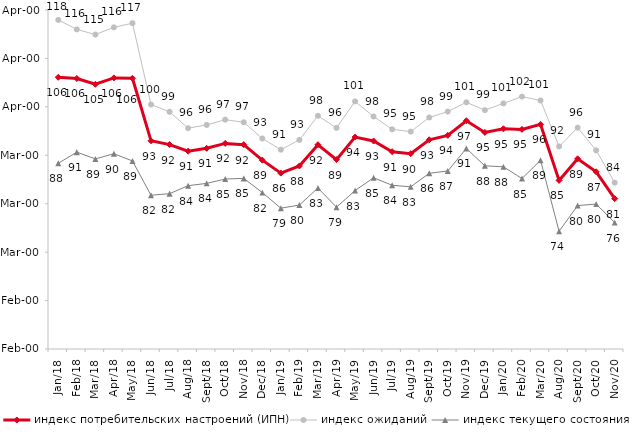
| Category | индекс потребительских настроений (ИПН) | Series 0 | индекс ожиданий | Series 3 | индекс текущего состояния |
|---|---|---|---|---|---|
| 2018-01-01 | 106.11 | 2018-01-01 | 117.95 | 2018-01-01 | 88.35 |
| 2018-02-01 | 105.86 | 2018-02-01 | 116 | 2018-02-01 | 90.65 |
| 2018-03-01 | 104.66 | 2018-03-01 | 114.933 | 2018-03-01 | 89.25 |
| 2018-04-01 | 105.98 | 2018-04-01 | 116.417 | 2018-04-01 | 90.325 |
| 2018-05-01 | 105.9 | 2018-05-01 | 117.283 | 2018-05-01 | 88.825 |
| 2018-06-01 | 92.99 | 2018-06-01 | 100.483 | 2018-06-01 | 81.75 |
| 2018-07-01 | 92.21 | 2018-07-01 | 98.967 | 2018-07-01 | 82.075 |
| 2018-08-01 | 90.85 | 2018-08-01 | 95.6 | 2018-08-01 | 83.725 |
| 2018-09-01 | 91.44 | 2018-09-01 | 96.267 | 2018-09-01 | 84.2 |
| 2018-10-01 | 92.45 | 2018-10-01 | 97.35 | 2018-10-01 | 85.1 |
| 2018-11-01 | 92.186 | 2018-11-01 | 96.823 | 2018-11-01 | 85.23 |
| 2018-12-01 | 89 | 2018-12-01 | 93.467 | 2018-12-01 | 82.3 |
| 2019-01-01 | 86.32 | 2019-01-01 | 91.15 | 2019-01-01 | 79.075 |
| 2019-02-01 | 87.8 | 2019-02-01 | 93.183 | 2019-02-01 | 79.725 |
| 2019-03-01 | 92.183 | 2019-03-01 | 98.144 | 2019-03-01 | 83.242 |
| 2019-04-01 | 89.109 | 2019-04-01 | 95.66 | 2019-04-01 | 79.282 |
| 2019-05-01 | 93.759 | 2019-05-01 | 101.123 | 2019-05-01 | 82.714 |
| 2019-06-01 | 92.948 | 2019-06-01 | 98.005 | 2019-06-01 | 85.362 |
| 2019-07-01 | 90.743 | 2019-07-01 | 95.363 | 2019-07-01 | 83.812 |
| 2019-08-01 | 90.33 | 2019-08-01 | 94.888 | 2019-08-01 | 83.492 |
| 2019-09-01 | 93.198 | 2019-09-01 | 97.805 | 2019-09-01 | 86.287 |
| 2019-10-01 | 94.119 | 2019-10-01 | 99.026 | 2019-10-01 | 86.757 |
| 2019-11-01 | 97.129 | 2019-11-01 | 100.941 | 2019-11-01 | 91.411 |
| 2019-12-01 | 94.723 | 2019-12-01 | 99.323 | 2019-12-01 | 87.822 |
| 2020-01-01 | 95.475 | 2020-01-01 | 100.71 | 2020-01-01 | 87.624 |
| 2020-02-01 | 95.347 | 2020-02-01 | 102.112 | 2020-02-01 | 85.198 |
| 2020-03-01 | 96.381 | 2020-03-01 | 101.322 | 2020-03-01 | 88.969 |
| 2020-08-01 | 84.816 | 2020-08-01 | 91.824 | 2020-08-01 | 74.305 |
| 2020-09-01 | 89.268 | 2020-09-01 | 95.703 | 2020-09-01 | 79.617 |
| 2020-10-01 | 86.587 | 2020-10-01 | 91.031 | 2020-10-01 | 79.92 |
| 2020-11-01 | 81.05 | 2020-11-01 | 84.35 | 2020-11-01 | 76.1 |